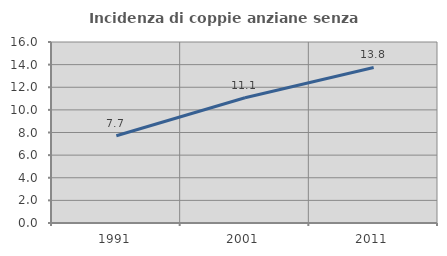
| Category | Incidenza di coppie anziane senza figli  |
|---|---|
| 1991.0 | 7.714 |
| 2001.0 | 11.075 |
| 2011.0 | 13.75 |